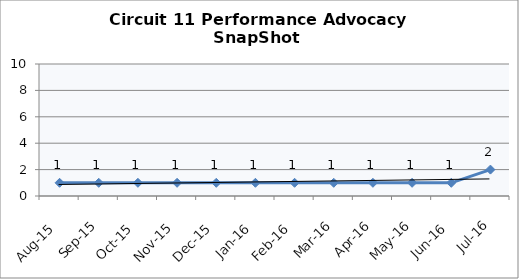
| Category | Circuit 11 |
|---|---|
| Aug-15 | 1 |
| Sep-15 | 1 |
| Oct-15 | 1 |
| Nov-15 | 1 |
| Dec-15 | 1 |
| Jan-16 | 1 |
| Feb-16 | 1 |
| Mar-16 | 1 |
| Apr-16 | 1 |
| May-16 | 1 |
| Jun-16 | 1 |
| Jul-16 | 2 |